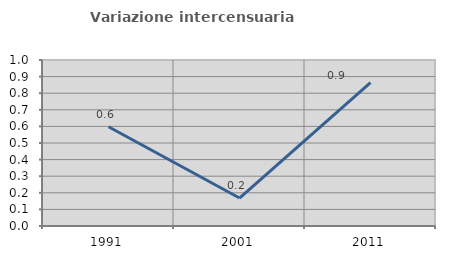
| Category | Variazione intercensuaria annua |
|---|---|
| 1991.0 | 0.598 |
| 2001.0 | 0.169 |
| 2011.0 | 0.864 |